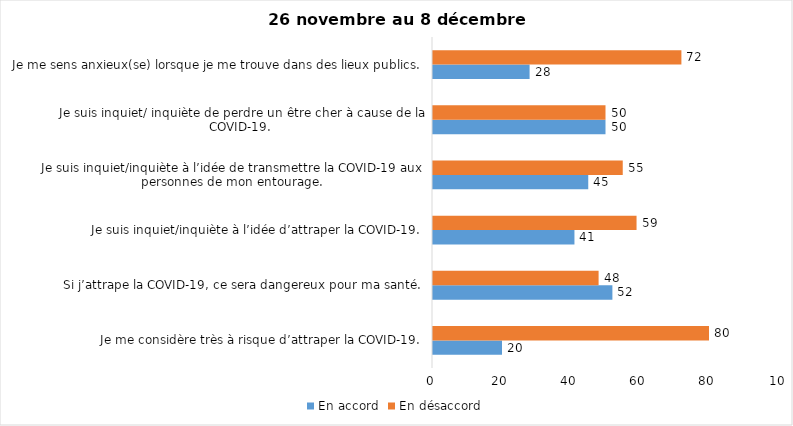
| Category | En accord | En désaccord |
|---|---|---|
| Je me considère très à risque d’attraper la COVID-19. | 20 | 80 |
| Si j’attrape la COVID-19, ce sera dangereux pour ma santé. | 52 | 48 |
| Je suis inquiet/inquiète à l’idée d’attraper la COVID-19. | 41 | 59 |
| Je suis inquiet/inquiète à l’idée de transmettre la COVID-19 aux personnes de mon entourage. | 45 | 55 |
| Je suis inquiet/ inquiète de perdre un être cher à cause de la COVID-19. | 50 | 50 |
| Je me sens anxieux(se) lorsque je me trouve dans des lieux publics. | 28 | 72 |